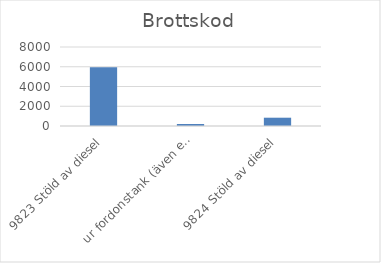
| Category | Summa |
|---|---|
| 9823 Stöld av diesel, ur fordonstank (även entreprenadmaskin m.m.) | 5940 |
| 9824 Stöld av diesel, ur större tankar (ej kopplade till fordon) | 200 |
| 9825 Stöld av drivmedel (även diesel), ej genom smitning | 840 |